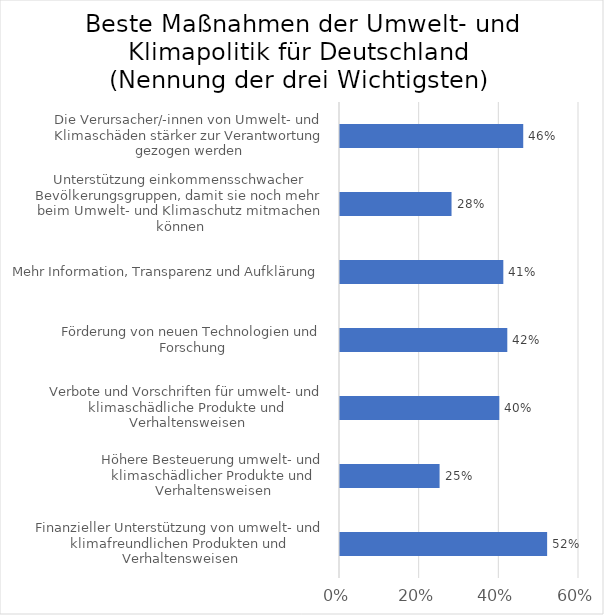
| Category | Series 0 |
|---|---|
| Finanzieller Unterstützung von umwelt- und klimafreundlichen Produkten und Verhaltensweisen | 0.52 |
| Höhere Besteuerung umwelt- und klimaschädlicher Produkte und Verhaltensweisen | 0.25 |
| Verbote und Vorschriften für umwelt- und klimaschädliche Produkte und Verhaltensweisen | 0.4 |
| Förderung von neuen Technologien und Forschung | 0.42 |
| Mehr Information, Transparenz und Aufklärung | 0.41 |
| Unterstützung einkommensschwacher Bevölkerungsgruppen, damit sie noch mehr beim Umwelt- und Klimaschutz mitmachen können | 0.28 |
| Die Verursacher/-innen von Umwelt- und Klimaschäden stärker zur Verantwortung gezogen werden | 0.46 |